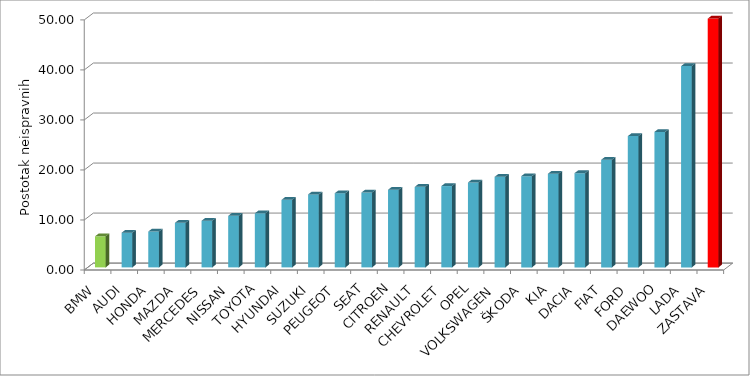
| Category | Series 4 |
|---|---|
| BMW | 6.208 |
| AUDI | 6.94 |
| HONDA | 7.167 |
| MAZDA | 8.915 |
| MERCEDES | 9.329 |
| NISSAN | 10.314 |
| TOYOTA | 10.814 |
| HYUNDAI | 13.504 |
| SUZUKI | 14.587 |
| PEUGEOT | 14.83 |
| SEAT | 14.966 |
| CITROEN | 15.522 |
| RENAULT | 16.098 |
| CHEVROLET | 16.254 |
| OPEL | 16.972 |
| VOLKSWAGEN | 18.103 |
| ŠKODA | 18.233 |
| KIA | 18.72 |
| DACIA | 18.843 |
| FIAT | 21.515 |
| FORD | 26.248 |
| DAEWOO | 27.087 |
| LADA | 40.237 |
| ZASTAVA | 49.736 |